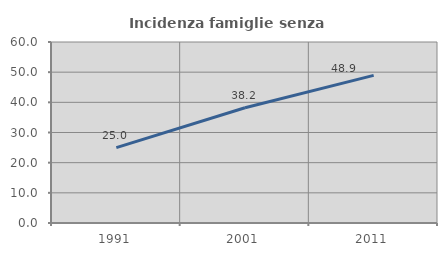
| Category | Incidenza famiglie senza nuclei |
|---|---|
| 1991.0 | 25 |
| 2001.0 | 38.194 |
| 2011.0 | 48.945 |